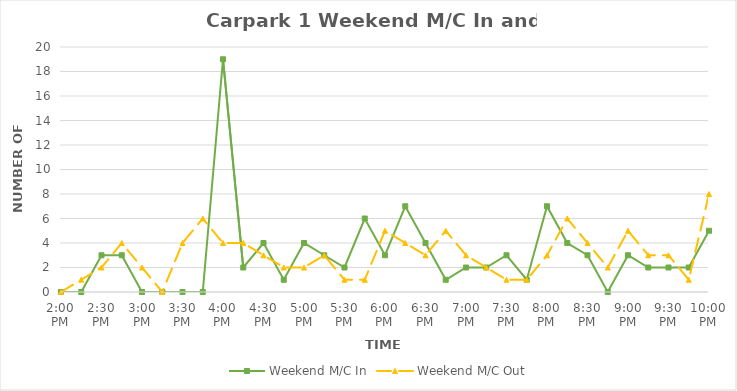
| Category | Weekend M/C In | Weekend M/C Out |
|---|---|---|
| 0.5833333333333334 | 0 | 0 |
| 0.59375 | 0 | 1 |
| 0.604166666666667 | 3 | 2 |
| 0.614583333333334 | 3 | 4 |
| 0.625 | 0 | 2 |
| 0.635416666666667 | 0 | 0 |
| 0.645833333333334 | 0 | 4 |
| 0.656250000000001 | 0 | 6 |
| 0.666666666666667 | 19 | 4 |
| 0.677083333333334 | 2 | 4 |
| 0.687500000000001 | 4 | 3 |
| 0.697916666666668 | 1 | 2 |
| 0.708333333333335 | 4 | 2 |
| 0.718750000000001 | 3 | 3 |
| 0.729166666666668 | 2 | 1 |
| 0.739583333333335 | 6 | 1 |
| 0.75 | 3 | 5 |
| 0.7604166666666666 | 7 | 4 |
| 0.7708333333333334 | 4 | 3 |
| 0.78125 | 1 | 5 |
| 0.7916666666666666 | 2 | 3 |
| 0.8020833333333334 | 2 | 2 |
| 0.8125 | 3 | 1 |
| 0.8229166666666666 | 1 | 1 |
| 0.8333333333333334 | 7 | 3 |
| 0.84375 | 4 | 6 |
| 0.8541666666666666 | 3 | 4 |
| 0.8645833333333334 | 0 | 2 |
| 0.875 | 3 | 5 |
| 0.8854166666666666 | 2 | 3 |
| 0.8958333333333334 | 2 | 3 |
| 0.90625 | 2 | 1 |
| 0.9166666666666666 | 5 | 8 |